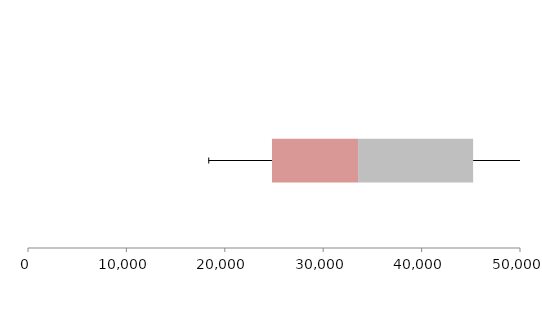
| Category | Series 1 | Series 2 | Series 3 |
|---|---|---|---|
| 0 | 24795.118 | 8749.956 | 11691.408 |